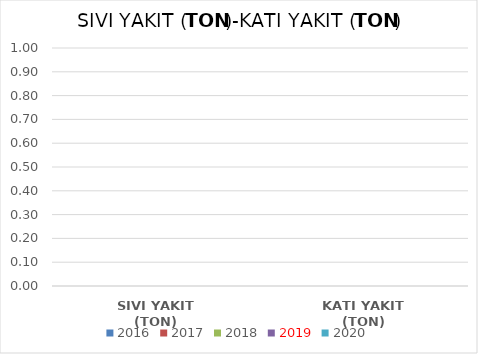
| Category | 2016 | 2017 | 2018 | 2019 | 2020 |
|---|---|---|---|---|---|
| SIVI YAKIT (TON) | 0 | 0 | 0 | 0 | 0 |
| KATI YAKIT (TON) | 0 | 0 | 0 | 0 | 0 |